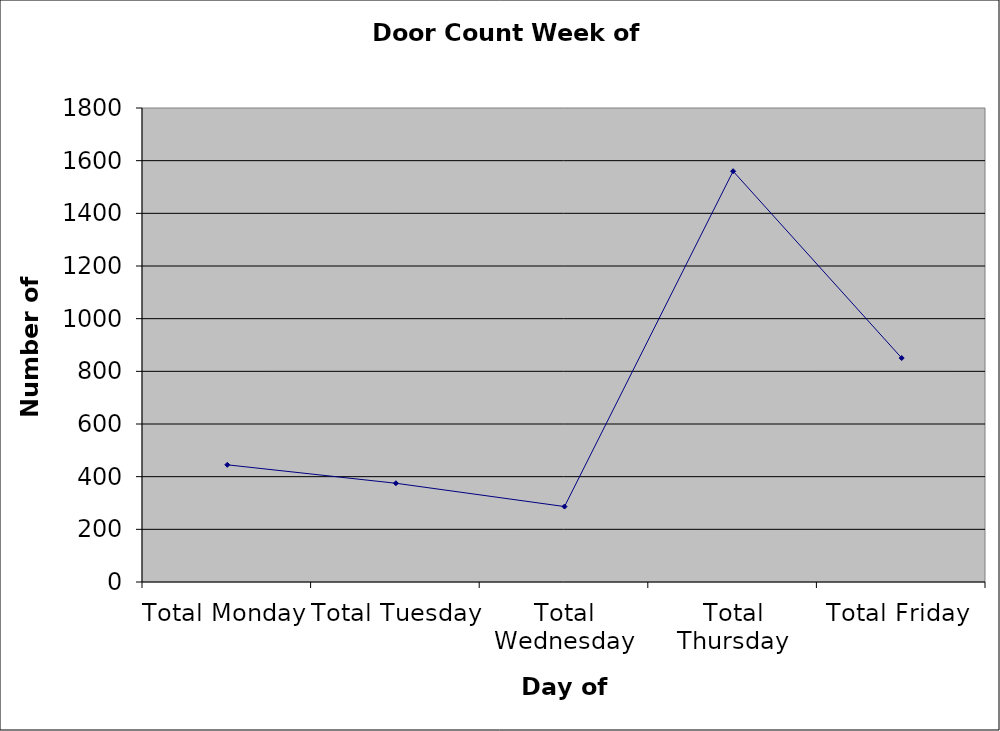
| Category | Series 0 |
|---|---|
| Total Monday | 445 |
| Total Tuesday | 375 |
| Total Wednesday | 286.5 |
| Total Thursday | 1560 |
| Total Friday | 850.5 |